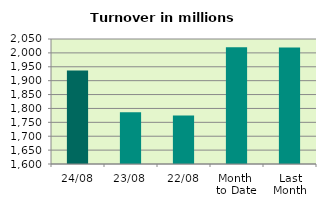
| Category | Series 0 |
|---|---|
| 24/08 | 1936.376 |
| 23/08 | 1786.424 |
| 22/08 | 1774.662 |
| Month 
to Date | 2020.711 |
| Last
Month | 2019.592 |